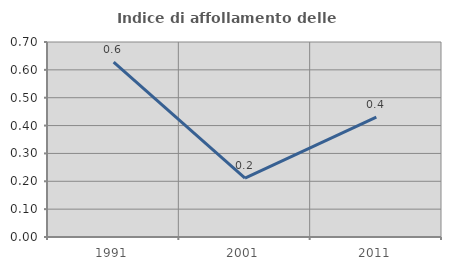
| Category | Indice di affollamento delle abitazioni  |
|---|---|
| 1991.0 | 0.628 |
| 2001.0 | 0.211 |
| 2011.0 | 0.43 |